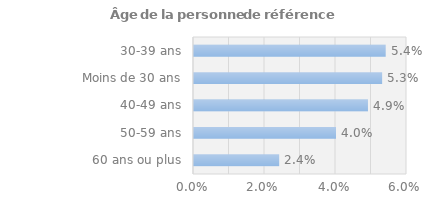
| Category | Series 0 |
|---|---|
| 60 ans ou plus | 0.024 |
| 50-59 ans | 0.04 |
| 40-49 ans | 0.049 |
| Moins de 30 ans | 0.053 |
| 30-39 ans | 0.054 |